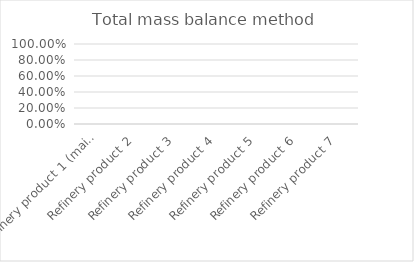
| Category | Series 0 | Series 1 | Series 2 |
|---|---|---|---|
| Refinery product 1 (main) | 0 | 0 | 0 |
| Refinery product 2 | 0 | 0 | 0 |
| Refinery product 3 | 0 | 0 | 0 |
| Refinery product 4 | 0 | 0 | 0 |
| Refinery product 5 | 0 | 0 | 0 |
| Refinery product 6 | 0 | 0 | 0 |
| Refinery product 7 | 0 | 0 | 0 |